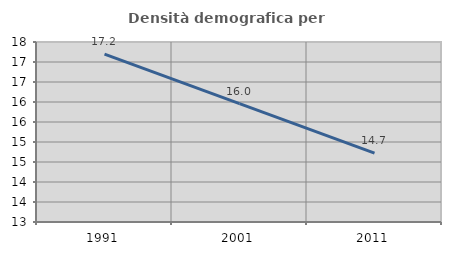
| Category | Densità demografica |
|---|---|
| 1991.0 | 17.199 |
| 2001.0 | 15.961 |
| 2011.0 | 14.722 |